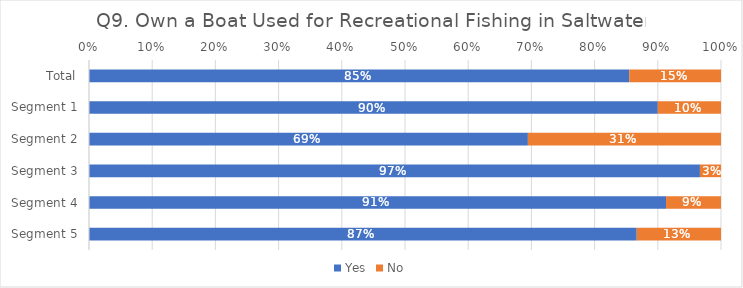
| Category | Yes | No |
|---|---|---|
| Total | 0.855 | 0.145 |
| Segment 1 | 0.9 | 0.1 |
| Segment 2 | 0.694 | 0.306 |
| Segment 3 | 0.967 | 0.033 |
| Segment 4 | 0.913 | 0.087 |
| Segment 5 | 0.867 | 0.133 |